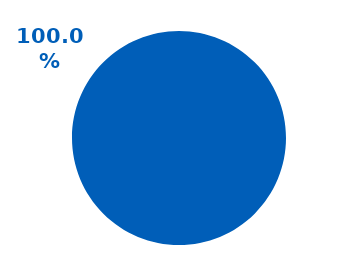
| Category | Series 0 |
|---|---|
| NACE | 1 |
| No_NACE | 0 |